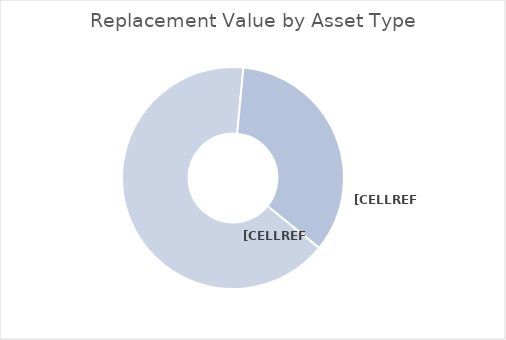
| Category | Series 1 |
|---|---|
| Garbage Trucks | 675000 |
| Firetruck | 353000 |
| Ambulance | 0 |
| Portable Generator | 0 |
| Portable Pump | 0 |
| Trailers | 0 |
| Tractors & Mowers | 0 |
| Excavators | 0 |
| Other | 0 |